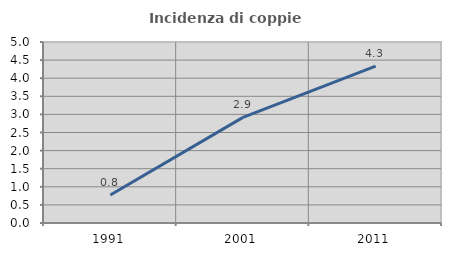
| Category | Incidenza di coppie miste |
|---|---|
| 1991.0 | 0.772 |
| 2001.0 | 2.918 |
| 2011.0 | 4.333 |